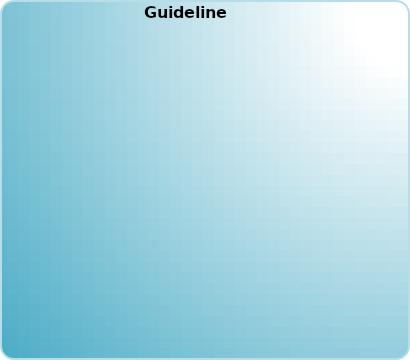
| Category | Series 0 |
|---|---|
| 
" ",(D82)) | 0 |
| 
" ",(E82)) | 0 |
| 
" ",(F82)) | 0 |
| 
" ",(G82)) | 0 |
| 
" ",(H82)) | 0 |
| 
" ",(I82)) | 0 |
| 
" ",(J82)) | 0 |
| 
" ",(K82)) | 0 |